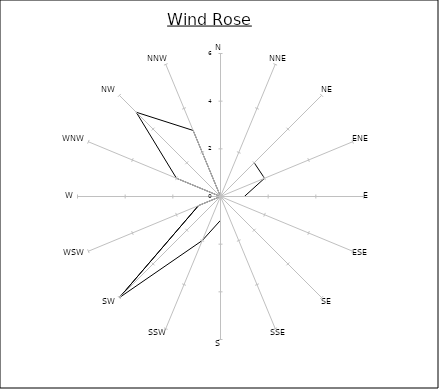
| Category | Series 0 |
|---|---|
| N | 0 |
| NNE | 0 |
| NE | 2 |
| ENE | 2 |
| E | 1 |
| ESE | 0 |
| SE | 0 |
| SSE | 0 |
| S | 1 |
| SSW | 2 |
| SW | 6 |
| WSW | 1 |
| W | 0 |
| WNW | 2 |
| NW | 5 |
| NNW | 3 |